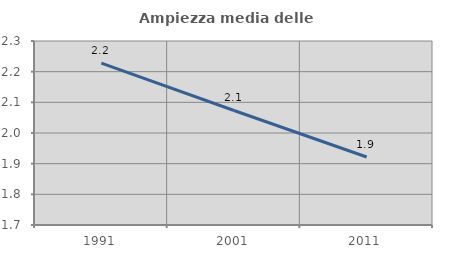
| Category | Ampiezza media delle famiglie |
|---|---|
| 1991.0 | 2.228 |
| 2001.0 | 2.073 |
| 2011.0 | 1.922 |